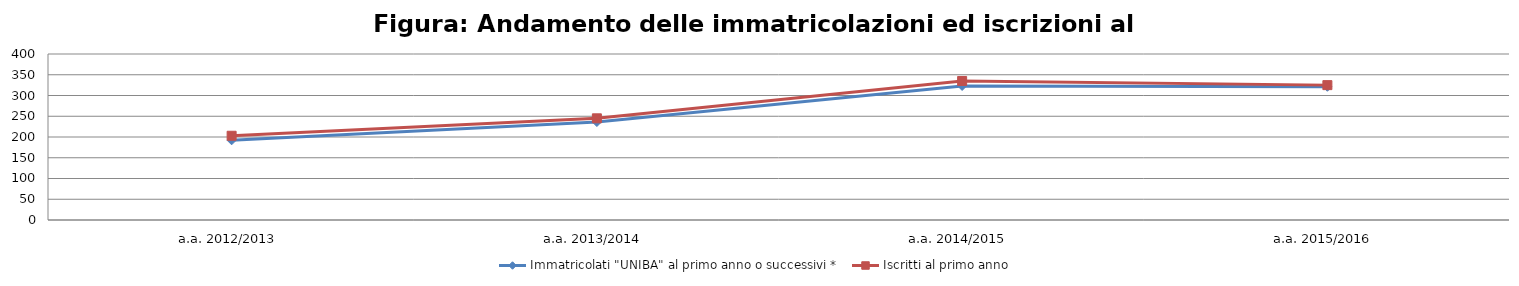
| Category | Immatricolati "UNIBA" al primo anno o successivi * | Iscritti al primo anno  |
|---|---|---|
| a.a. 2012/2013 | 192 | 203 |
| a.a. 2013/2014 | 236 | 245 |
| a.a. 2014/2015 | 323 | 335 |
| a.a. 2015/2016 | 321 | 325 |